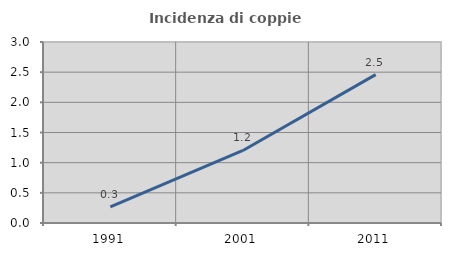
| Category | Incidenza di coppie miste |
|---|---|
| 1991.0 | 0.269 |
| 2001.0 | 1.203 |
| 2011.0 | 2.459 |